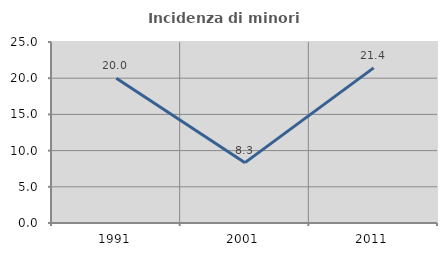
| Category | Incidenza di minori stranieri |
|---|---|
| 1991.0 | 20 |
| 2001.0 | 8.333 |
| 2011.0 | 21.429 |